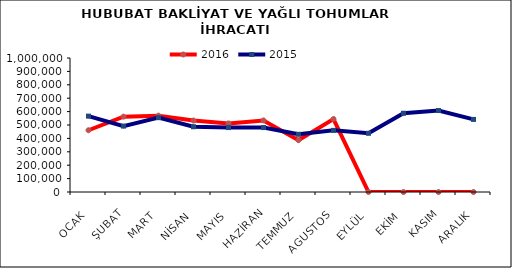
| Category | 2016 | 2015 |
|---|---|---|
| OCAK | 460818.861 | 566117.666 |
| ŞUBAT | 562438.608 | 491783.754 |
| MART | 569748.927 | 554740.764 |
| NİSAN | 533211.208 | 486976.493 |
| MAYIS | 511827.142 | 480848.67 |
| HAZİRAN | 534034.526 | 480768.242 |
| TEMMUZ | 386718.942 | 430668.388 |
| AGUSTOS | 544356.202 | 459881.613 |
| EYLÜL | 0 | 438173.997 |
| EKİM | 0 | 587624.926 |
| KASIM | 0 | 607952.096 |
| ARALIK | 0 | 541773.57 |